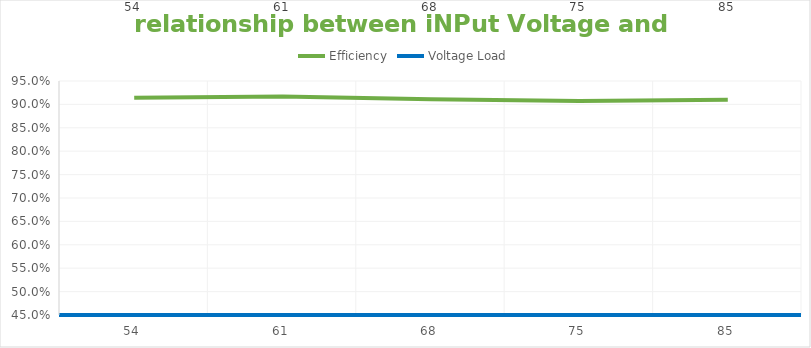
| Category | Efficiency | Voltage Load |
|---|---|---|
| 54.0 | 0.914 | 54 |
| 61.0 | 0.917 | 61 |
| 68.0 | 0.911 | 68 |
| 75.0 | 0.907 | 75 |
| 85.0 | 0.91 | 85 |